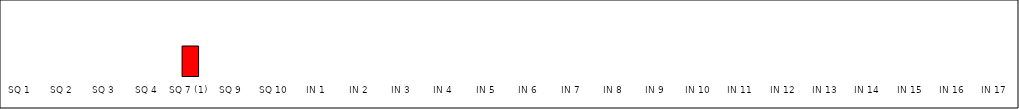
| Category | Series 0 |
|---|---|
| SQ 1 | 0 |
| SQ 2 | 0 |
| SQ 3 | 0 |
| SQ 4 | 0 |
| SQ 7 (1) | 1 |
| SQ 9 | 0 |
| SQ 10 | 0 |
| IN 1 | 0 |
| IN 2 | 0 |
| IN 3 | 0 |
| IN 4 | 0 |
| IN 5 | 0 |
| IN 6 | 0 |
| IN 7 | 0 |
| IN 8 | 0 |
| IN 9 | 0 |
| IN 10 | 0 |
| IN 11 | 0 |
| IN 12 | 0 |
| IN 13 | 0 |
| IN 14 | 0 |
| IN 15 | 0 |
| IN 16 | 0 |
| IN 17 | 0 |